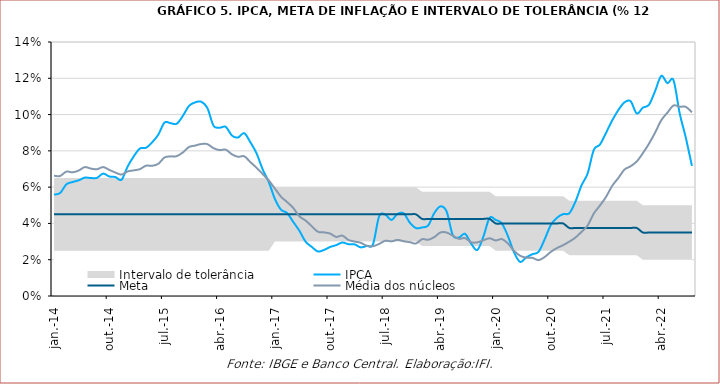
| Category | IPCA | Meta | Média dos núcleos |
|---|---|---|---|
| 2014-01-01 | 0.056 | 0.045 | 0.066 |
| 2014-02-01 | 0.057 | 0.045 | 0.066 |
| 2014-03-01 | 0.062 | 0.045 | 0.069 |
| 2014-04-01 | 0.063 | 0.045 | 0.068 |
| 2014-05-01 | 0.064 | 0.045 | 0.069 |
| 2014-06-01 | 0.065 | 0.045 | 0.071 |
| 2014-07-01 | 0.065 | 0.045 | 0.07 |
| 2014-08-01 | 0.065 | 0.045 | 0.07 |
| 2014-09-01 | 0.067 | 0.045 | 0.071 |
| 2014-10-01 | 0.066 | 0.045 | 0.07 |
| 2014-11-01 | 0.066 | 0.045 | 0.068 |
| 2014-12-01 | 0.064 | 0.045 | 0.067 |
| 2015-01-01 | 0.071 | 0.045 | 0.069 |
| 2015-02-01 | 0.077 | 0.045 | 0.069 |
| 2015-03-01 | 0.081 | 0.045 | 0.07 |
| 2015-04-01 | 0.082 | 0.045 | 0.072 |
| 2015-05-01 | 0.085 | 0.045 | 0.072 |
| 2015-06-01 | 0.089 | 0.045 | 0.073 |
| 2015-07-01 | 0.096 | 0.045 | 0.076 |
| 2015-08-01 | 0.095 | 0.045 | 0.077 |
| 2015-09-01 | 0.095 | 0.045 | 0.077 |
| 2015-10-01 | 0.099 | 0.045 | 0.079 |
| 2015-11-01 | 0.105 | 0.045 | 0.082 |
| 2015-12-01 | 0.107 | 0.045 | 0.083 |
| 2016-01-01 | 0.107 | 0.045 | 0.084 |
| 2016-02-01 | 0.104 | 0.045 | 0.084 |
| 2016-03-01 | 0.094 | 0.045 | 0.081 |
| 2016-04-01 | 0.093 | 0.045 | 0.08 |
| 2016-05-01 | 0.093 | 0.045 | 0.081 |
| 2016-06-01 | 0.088 | 0.045 | 0.078 |
| 2016-07-01 | 0.087 | 0.045 | 0.077 |
| 2016-08-01 | 0.09 | 0.045 | 0.077 |
| 2016-09-01 | 0.085 | 0.045 | 0.074 |
| 2016-10-01 | 0.079 | 0.045 | 0.071 |
| 2016-11-01 | 0.07 | 0.045 | 0.067 |
| 2016-12-01 | 0.063 | 0.045 | 0.064 |
| 2017-01-01 | 0.054 | 0.045 | 0.059 |
| 2017-02-01 | 0.048 | 0.045 | 0.055 |
| 2017-03-01 | 0.046 | 0.045 | 0.052 |
| 2017-04-01 | 0.041 | 0.045 | 0.049 |
| 2017-05-01 | 0.036 | 0.045 | 0.044 |
| 2017-06-01 | 0.03 | 0.045 | 0.042 |
| 2017-07-01 | 0.027 | 0.045 | 0.038 |
| 2017-08-01 | 0.025 | 0.045 | 0.035 |
| 2017-09-01 | 0.025 | 0.045 | 0.035 |
| 2017-10-01 | 0.027 | 0.045 | 0.034 |
| 2017-11-01 | 0.028 | 0.045 | 0.033 |
| 2017-12-01 | 0.029 | 0.045 | 0.033 |
| 2018-01-01 | 0.029 | 0.045 | 0.031 |
| 2018-02-01 | 0.028 | 0.045 | 0.03 |
| 2018-03-01 | 0.027 | 0.045 | 0.029 |
| 2018-04-01 | 0.028 | 0.045 | 0.028 |
| 2018-05-01 | 0.029 | 0.045 | 0.027 |
| 2018-06-01 | 0.044 | 0.045 | 0.029 |
| 2018-07-01 | 0.045 | 0.045 | 0.03 |
| 2018-08-01 | 0.042 | 0.045 | 0.03 |
| 2018-09-01 | 0.045 | 0.045 | 0.031 |
| 2018-10-01 | 0.046 | 0.045 | 0.03 |
| 2018-11-01 | 0.04 | 0.045 | 0.03 |
| 2018-12-01 | 0.037 | 0.045 | 0.029 |
| 2019-01-01 | 0.038 | 0.042 | 0.031 |
| 2019-02-01 | 0.039 | 0.042 | 0.031 |
| 2019-03-01 | 0.046 | 0.042 | 0.032 |
| 2019-04-01 | 0.049 | 0.042 | 0.035 |
| 2019-05-01 | 0.047 | 0.042 | 0.035 |
| 2019-06-01 | 0.034 | 0.042 | 0.033 |
| 2019-07-01 | 0.032 | 0.042 | 0.032 |
| 2019-08-01 | 0.034 | 0.042 | 0.032 |
| 2019-09-01 | 0.029 | 0.042 | 0.03 |
| 2019-10-01 | 0.025 | 0.042 | 0.03 |
| 2019-11-01 | 0.033 | 0.042 | 0.031 |
| 2019-12-01 | 0.043 | 0.042 | 0.032 |
| 2020-01-01 | 0.042 | 0.04 | 0.031 |
| 2020-02-01 | 0.04 | 0.04 | 0.031 |
| 2020-03-01 | 0.033 | 0.04 | 0.029 |
| 2020-04-01 | 0.024 | 0.04 | 0.025 |
| 2020-05-01 | 0.019 | 0.04 | 0.022 |
| 2020-06-01 | 0.021 | 0.04 | 0.021 |
| 2020-07-01 | 0.023 | 0.04 | 0.021 |
| 2020-08-01 | 0.024 | 0.04 | 0.02 |
| 2020-09-01 | 0.031 | 0.04 | 0.022 |
| 2020-10-01 | 0.039 | 0.04 | 0.024 |
| 2020-11-01 | 0.043 | 0.04 | 0.026 |
| 2020-12-01 | 0.045 | 0.04 | 0.028 |
| 2021-01-01 | 0.046 | 0.038 | 0.03 |
| 2021-02-01 | 0.052 | 0.038 | 0.032 |
| 2021-03-01 | 0.061 | 0.038 | 0.035 |
| 2021-04-01 | 0.068 | 0.038 | 0.039 |
| 2021-05-01 | 0.081 | 0.038 | 0.045 |
| 2021-06-01 | 0.083 | 0.038 | 0.05 |
| 2021-07-01 | 0.09 | 0.038 | 0.055 |
| 2021-08-01 | 0.097 | 0.038 | 0.061 |
| 2021-09-01 | 0.102 | 0.038 | 0.065 |
| 2021-10-01 | 0.107 | 0.038 | 0.07 |
| 2021-11-01 | 0.107 | 0.038 | 0.072 |
| 2021-12-01 | 0.101 | 0.038 | 0.074 |
| 2022-01-01 | 0.104 | 0.035 | 0.079 |
| 2022-02-01 | 0.105 | 0.035 | 0.084 |
| 2022-03-01 | 0.113 | 0.035 | 0.09 |
| 2022-04-01 | 0.121 | 0.035 | 0.097 |
| 2022-05-01 | 0.117 | 0.035 | 0.101 |
| 2022-06-01 | 0.119 | 0.035 | 0.105 |
| 2022-07-01 | 0.101 | 0.035 | 0.104 |
| 2022-08-01 | 0.087 | 0.035 | 0.104 |
| 2022-09-01 | 0.072 | 0.035 | 0.101 |